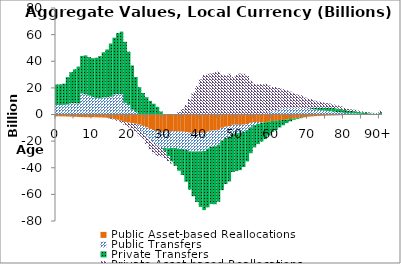
| Category | Public Asset-based Reallocations | Public Transfers | Private Transfers | Private Asset-based Reallocations |
|---|---|---|---|---|
| 0 | -1362.428 | 7115.329 | 15424.118 | 0 |
|  | -1379.174 | 7098.955 | 15508.026 | 0 |
| 2 | -1426.299 | 7235.37 | 15924.417 | 0 |
| 3 | -1515.082 | 7481.698 | 20610.805 | 0 |
| 4 | -1608.048 | 8538.853 | 23240.93 | 0 |
| 5 | -1718.044 | 8510.576 | 25407.215 | 0 |
| 6 | -1829.912 | 8315.981 | 27637.973 | 0 |
| 7 | -1947.079 | 15805.261 | 28204.765 | 0 |
| 8 | -2030.479 | 15175.612 | 29240.108 | 0 |
| 9 | -2057.863 | 14209.49 | 28872.986 | 0 |
| 10 | -2060.494 | 13204.498 | 29076.78 | 0 |
| 11 | -2093.56 | 12515.507 | 30104.654 | 0 |
| 12 | -2176.452 | 12202.779 | 31667.287 | 0 |
| 13 | -2276.607 | 12852.156 | 33916.751 | 0 |
| 14 | -2437.932 | 12996.188 | 35869.759 | 0 |
| 15 | -2659.173 | 13424.933 | 39900.61 | -605.24 |
| 16 | -3303.817 | 15006.381 | 42711.763 | -646.75 |
| 17 | -3969.14 | 15397.382 | 45763.564 | -850.497 |
| 18 | -4770.903 | 15287.747 | 46998.473 | -1468.702 |
| 19 | -5588.471 | 8873.807 | 45766.29 | -2214.057 |
| 20 | -6124.689 | 7123.598 | 40084.861 | -3494.491 |
| 21 | -6569.25 | 3632.594 | 33178.733 | -4169.673 |
| 22 | -6997.166 | 2099.174 | 26056.528 | -6047.105 |
| 23 | -7644.858 | -4040.498 | 20486.716 | -4629.216 |
| 24 | -8573.168 | -5452.348 | 16155.658 | -4480.535 |
| 25 | -9750.024 | -6988.336 | 13011.182 | -5477.887 |
| 26 | -10851.124 | -8494.354 | 10228.231 | -6826.049 |
| 27 | -11646.117 | -9702.489 | 8093.925 | -7800.237 |
| 28 | -12436.222 | -10845.993 | 5783.032 | -8028.837 |
| 29 | -12786.074 | -11554.104 | 2237.707 | -7137.902 |
| 30 | -12896.46 | -12299.977 | -2093.972 | -5353.142 |
| 31 | -12860.188 | -12509.032 | -5989.835 | -3605.736 |
| 32 | -12654.787 | -12523.272 | -10142.398 | -1454.301 |
| 33 | -12582.993 | -12598.386 | -13373.058 | 123.936 |
| 34 | -12819.071 | -12960.071 | -16490.586 | 1835.25 |
| 35 | -12842.871 | -13079.403 | -19539.27 | 4038.088 |
| 36 | -13214.043 | -13526.648 | -23785.132 | 7190.202 |
| 37 | -13684.908 | -13971.602 | -28765.061 | 11729.307 |
| 38 | -13763.091 | -14021.427 | -33600.959 | 16371.594 |
| 39 | -13796.749 | -13947.61 | -38051.423 | 21375.439 |
| 40 | -13819.006 | -13865.742 | -41718.679 | 26368.856 |
| 41 | -13701.588 | -13651.446 | -44451.666 | 29718.032 |
| 42 | -12899.045 | -12808.586 | -44009.416 | 30529.554 |
| 43 | -12168.649 | -12033.91 | -43067.955 | 30773.723 |
| 44 | -12019.205 | -11781.065 | -43595.257 | 31829.262 |
| 45 | -11564.448 | -11178.398 | -42754.726 | 32150.131 |
| 46 | -10021.44 | -9453.092 | -37366.242 | 29834.94 |
| 47 | -9210.585 | -8432.491 | -34568.69 | 29479.667 |
| 48 | -8934.581 | -7888.819 | -33477.643 | 30609.361 |
| 49 | -7736.986 | -6539.545 | -28917.836 | 28210.912 |
| 50 | -7748.506 | -6239.699 | -28535.118 | 29636.291 |
| 51 | -7820.321 | -5964.842 | -28022.613 | 30773.276 |
| 52 | -7663.207 | -5427.761 | -26337.364 | 30547.479 |
| 53 | -7176.364 | -4547.798 | -23527.506 | 28921.502 |
| 54 | -6275.436 | -3308.541 | -19500.26 | 25404.298 |
| 55 | -5684.99 | -2270.922 | -16699.191 | 23074.094 |
| 56 | -5577.038 | -1423.796 | -15239.371 | 22607.628 |
| 57 | -5698.064 | -493.423 | -14122.687 | 22773.422 |
| 58 | -5785.126 | 541.289 | -12707.411 | 22488.356 |
| 59 | -5331.918 | 1549.276 | -10344.142 | 20291.794 |
| 60 | -4883.453 | 2311.992 | -8196.684 | 18306.727 |
| 61 | -4722.274 | 3153.226 | -6828.766 | 17476.025 |
| 62 | -4399.74 | 3872.928 | -5349.041 | 15943.53 |
| 63 | -4080.809 | 4467.193 | -3992.522 | 14567.726 |
| 64 | -3735.953 | 4924.745 | -2715.065 | 13165.412 |
| 65 | -3378.735 | 5130.676 | -1784.515 | 12011.765 |
| 66 | -2950.739 | 5110.751 | -1048.1 | 10810.887 |
| 67 | -2544.821 | 5044.407 | -703.582 | 9981.602 |
| 68 | -2262.735 | 4923.091 | -520.599 | 9554.767 |
| 69 | -1861.251 | 4490.23 | -175.473 | 8253.552 |
| 70 | -1616.308 | 4282.558 | 273.361 | 7378.003 |
| 71 | -1447.935 | 4143.902 | 761.508 | 6644.571 |
| 72 | -1217.59 | 3691.105 | 1227.028 | 5473.515 |
| 73 | -1050.959 | 3377.537 | 1708.546 | 4572.72 |
| 74 | -932.098 | 3072.738 | 2053.422 | 3889.532 |
| 75 | -830.987 | 2765.799 | 2342.79 | 3400.627 |
| 76 | -778.27 | 2536.202 | 2592.11 | 3117.317 |
| 77 | -692.032 | 2196.015 | 2647.31 | 2678.611 |
| 78 | -619.503 | 1859.106 | 2605.496 | 2335.637 |
| 79 | -552.928 | 1592.594 | 2535.168 | 2021.724 |
| 80 | -437.389 | 1231.089 | 2152.234 | 1600.648 |
| 81 | -368.309 | 1014.74 | 1914.293 | 1299.435 |
| 82 | -331.55 | 900.851 | 1773.478 | 1176.488 |
| 83 | -304.155 | 815.707 | 1632.066 | 1122.498 |
| 84 | -254.981 | 669.027 | 1333.742 | 1011.293 |
| 85 | -200.781 | 509.91 | 1014.084 | 859.355 |
| 86 | -160.115 | 388.76 | 770.435 | 746.571 |
| 87 | -131.23 | 301.788 | 590.439 | 667.291 |
| 88 | -106.011 | 230.355 | 427.503 | 597.023 |
| 89 | -83.312 | 169.771 | 296.805 | 514.759 |
| 90+ | -237.732 | 452.201 | 735.148 | 1598.348 |